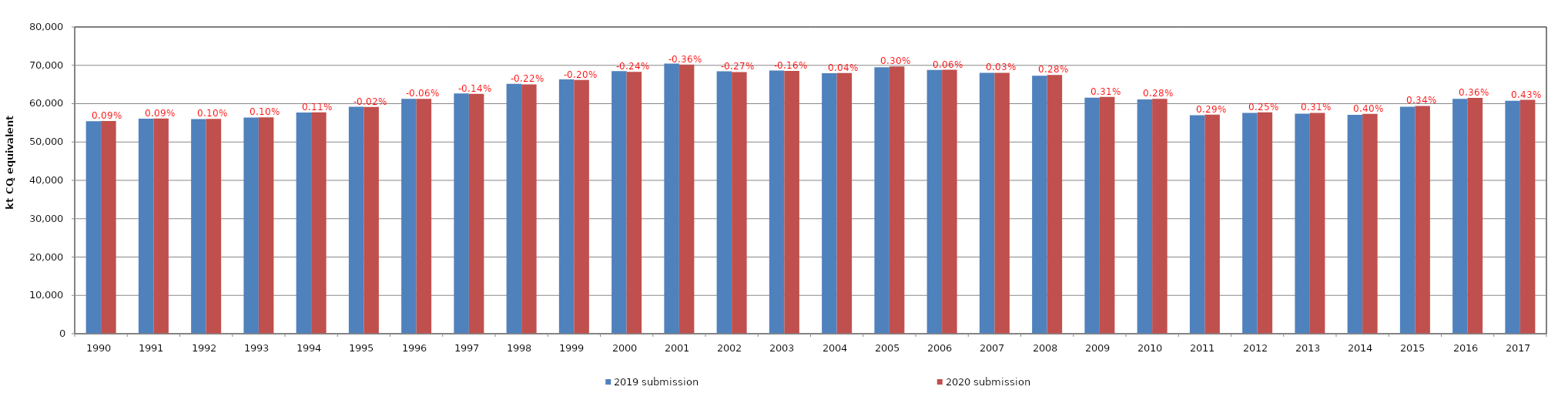
| Category | 2019 submission | 2020 submission |
|---|---|---|
| 1990.0 | 55417.063 | 55468.296 |
| 1991.0 | 56097.262 | 56146.921 |
| 1992.0 | 55959.166 | 56013.364 |
| 1993.0 | 56359.815 | 56416.307 |
| 1994.0 | 57697.026 | 57760.823 |
| 1995.0 | 59177.472 | 59164.253 |
| 1996.0 | 61272.677 | 61234.153 |
| 1997.0 | 62652.431 | 62565.155 |
| 1998.0 | 65173.64 | 65031.485 |
| 1999.0 | 66308.691 | 66174.541 |
| 2000.0 | 68478.407 | 68314.276 |
| 2001.0 | 70475.259 | 70221.215 |
| 2002.0 | 68428.659 | 68244.217 |
| 2003.0 | 68662.575 | 68550.017 |
| 2004.0 | 67963.834 | 67990.207 |
| 2005.0 | 69495.032 | 69702.107 |
| 2006.0 | 68782.226 | 68825.586 |
| 2007.0 | 68018.498 | 68042.033 |
| 2008.0 | 67301.827 | 67490.636 |
| 2009.0 | 61547.234 | 61736.431 |
| 2010.0 | 61104.844 | 61277.543 |
| 2011.0 | 56989.193 | 57156.859 |
| 2012.0 | 57611.534 | 57752.702 |
| 2013.0 | 57410.215 | 57589.735 |
| 2014.0 | 57098.537 | 57325.318 |
| 2015.0 | 59211.813 | 59415.925 |
| 2016.0 | 61270.202 | 61491.44 |
| 2017.0 | 60743.725 | 61004.876 |